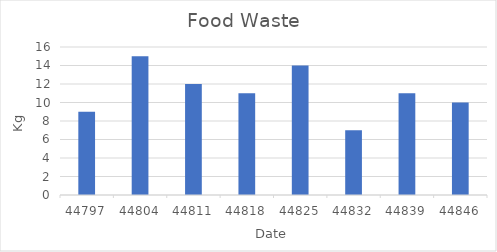
| Category | Food Waste (Kg) |
|---|---|
| 44797.0 | 9 |
| 44804.0 | 15 |
| 44811.0 | 12 |
| 44818.0 | 11 |
| 44825.0 | 14 |
| 44832.0 | 7 |
| 44839.0 | 11 |
| 44846.0 | 10 |